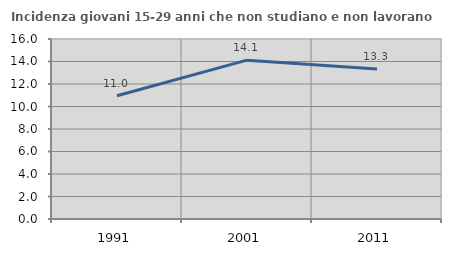
| Category | Incidenza giovani 15-29 anni che non studiano e non lavorano  |
|---|---|
| 1991.0 | 10.959 |
| 2001.0 | 14.118 |
| 2011.0 | 13.333 |